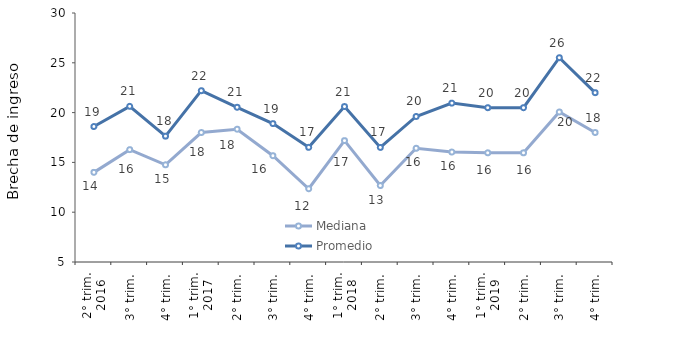
| Category | Mediana | Promedio |
|---|---|---|
| 0 | 14 | 18.602 |
| 1 | 16.28 | 20.629 |
| 2 | 14.762 | 17.634 |
| 3 | 18 | 22.2 |
| 4 | 18.333 | 20.534 |
| 5 | 15.672 | 18.896 |
| 6 | 12.353 | 16.513 |
| 7 | 17.188 | 20.607 |
| 8 | 12.677 | 16.505 |
| 9 | 16.418 | 19.61 |
| 10 | 16.04 | 20.951 |
| 11 | 15.962 | 20.491 |
| 12 | 15.962 | 20.491 |
| 13 | 20.061 | 25.512 |
| 14 | 18 | 22 |